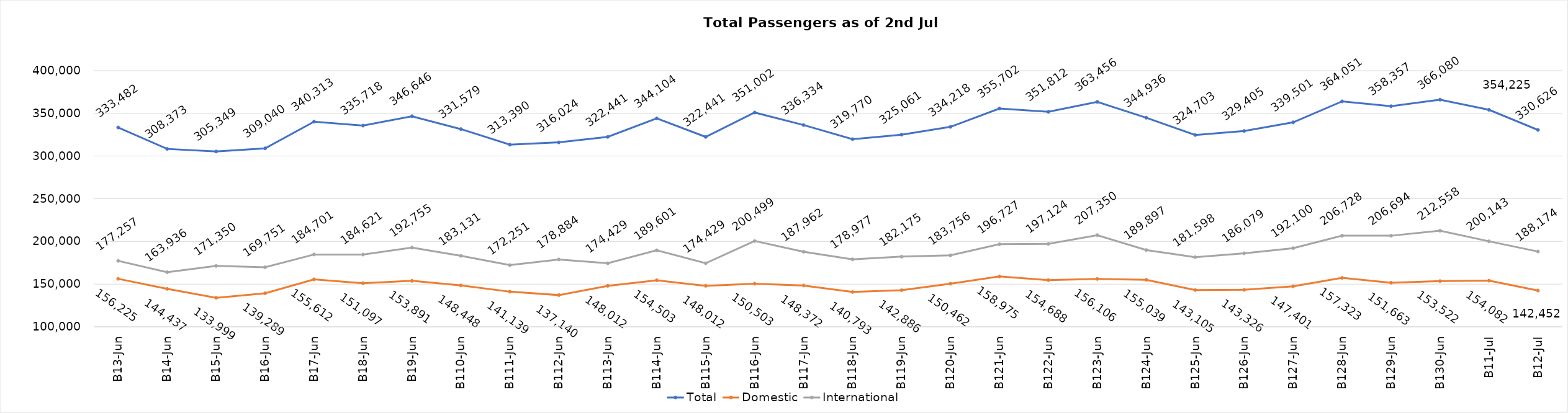
| Category |  Total  | Domestic | International |
|---|---|---|---|
| 2024-06-03 | 333482 | 156225 | 177257 |
| 2024-06-04 | 308373 | 144437 | 163936 |
| 2024-06-05 | 305349 | 133999 | 171350 |
| 2024-06-06 | 309040 | 139289 | 169751 |
| 2024-06-07 | 340313 | 155612 | 184701 |
| 2024-06-08 | 335718 | 151097 | 184621 |
| 2024-06-09 | 346646 | 153891 | 192755 |
| 2024-06-10 | 331579 | 148448 | 183131 |
| 2024-06-11 | 313390 | 141139 | 172251 |
| 2024-06-12 | 316024 | 137140 | 178884 |
| 2024-06-13 | 322441 | 148012 | 174429 |
| 2024-06-14 | 344104 | 154503 | 189601 |
| 2024-06-15 | 322441 | 148012 | 174429 |
| 2024-06-16 | 351002 | 150503 | 200499 |
| 2024-06-17 | 336334 | 148372 | 187962 |
| 2024-06-18 | 319770 | 140793 | 178977 |
| 2024-06-19 | 325061 | 142886 | 182175 |
| 2024-06-20 | 334218 | 150462 | 183756 |
| 2024-06-21 | 355702 | 158975 | 196727 |
| 2024-06-22 | 351812 | 154688 | 197124 |
| 2024-06-23 | 363456 | 156106 | 207350 |
| 2024-06-24 | 344936 | 155039 | 189897 |
| 2024-06-25 | 324703 | 143105 | 181598 |
| 2024-06-26 | 329405 | 143326 | 186079 |
| 2024-06-27 | 339501 | 147401 | 192100 |
| 2024-06-28 | 364051 | 157323 | 206728 |
| 2024-06-29 | 358357 | 151663 | 206694 |
| 2024-06-30 | 366080 | 153522 | 212558 |
| 2024-07-01 | 354225 | 154082 | 200143 |
| 2024-07-02 | 330626 | 142452 | 188174 |